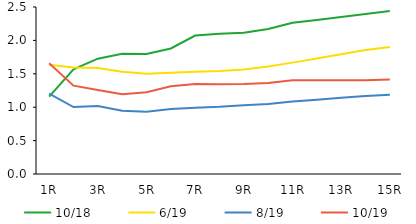
| Category | 10/18 | 6/19 | 8/19 | 10/19 |
|---|---|---|---|---|
|  1R | 1.159 | 1.637 | 1.203 | 1.656 |
|  2R | 1.569 | 1.595 | 1.003 | 1.322 |
|  3R | 1.727 | 1.587 | 1.018 | 1.257 |
|  4R | 1.801 | 1.531 | 0.946 | 1.195 |
|  5R | 1.796 | 1.499 | 0.931 | 1.224 |
|  6R | 1.88 | 1.516 | 0.972 | 1.314 |
|  7R | 2.073 | 1.529 | 0.993 | 1.348 |
|  8R | 2.101 | 1.543 | 1.006 | 1.342 |
|  9R | 2.116 | 1.565 | 1.03 | 1.347 |
|  10R | 2.171 | 1.611 | 1.046 | 1.363 |
|  11R | 2.264 | 1.667 | 1.086 | 1.402 |
|  12R | 2.307 | 1.731 | 1.113 | 1.402 |
|  13R | 2.351 | 1.794 | 1.14 | 1.403 |
|  14R | 2.395 | 1.857 | 1.167 | 1.404 |
|  15R | 2.44 | 1.902 | 1.187 | 1.415 |